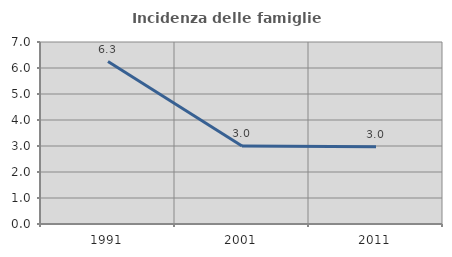
| Category | Incidenza delle famiglie numerose |
|---|---|
| 1991.0 | 6.25 |
| 2001.0 | 2.999 |
| 2011.0 | 2.968 |